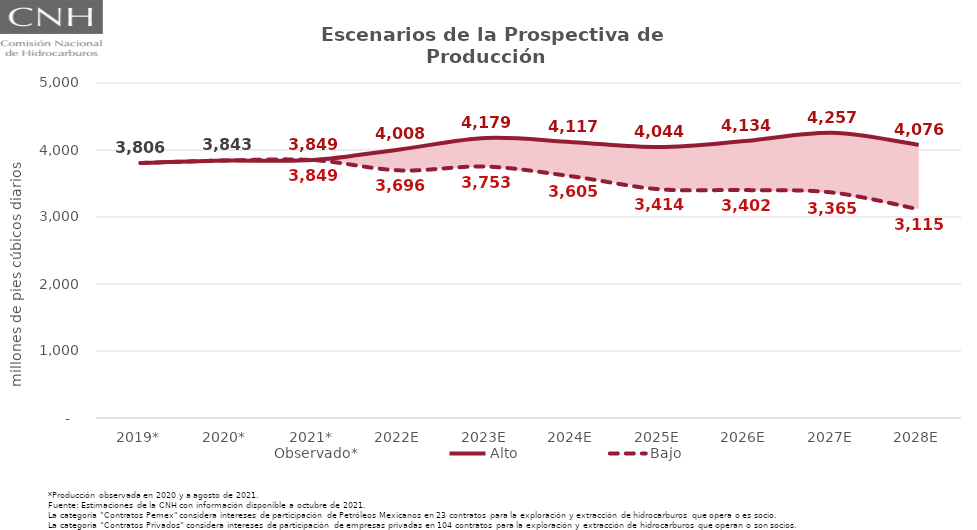
| Category | Observado* | Alto | Bajo |
|---|---|---|---|
| 2019* | 3805.803 | 3805.803 | 3805.803 |
| 2020* | 3843.294 | 3843.294 | 3843.294 |
| 2021* | 3849.199 | 3849.199 | 3849.199 |
| 2022E | 3853.981 | 4008.376 | 3695.897 |
| 2023E | 4008.421 | 4179.05 | 3752.533 |
| 2024E | 3929.344 | 4117.394 | 3605.114 |
| 2025E | 3781.721 | 4043.836 | 3414.018 |
| 2026E | 3818.195 | 4134.109 | 3401.955 |
| 2027E | 3841.453 | 4256.774 | 3365.437 |
| 2028E | 3597.706 | 4076.424 | 3114.746 |